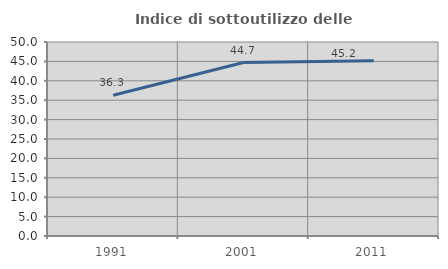
| Category | Indice di sottoutilizzo delle abitazioni  |
|---|---|
| 1991.0 | 36.284 |
| 2001.0 | 44.712 |
| 2011.0 | 45.184 |